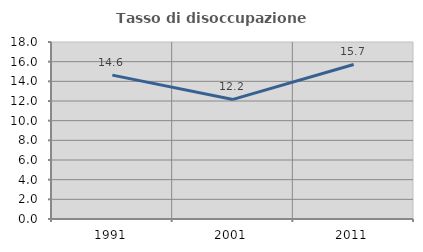
| Category | Tasso di disoccupazione giovanile  |
|---|---|
| 1991.0 | 14.634 |
| 2001.0 | 12.162 |
| 2011.0 | 15.714 |